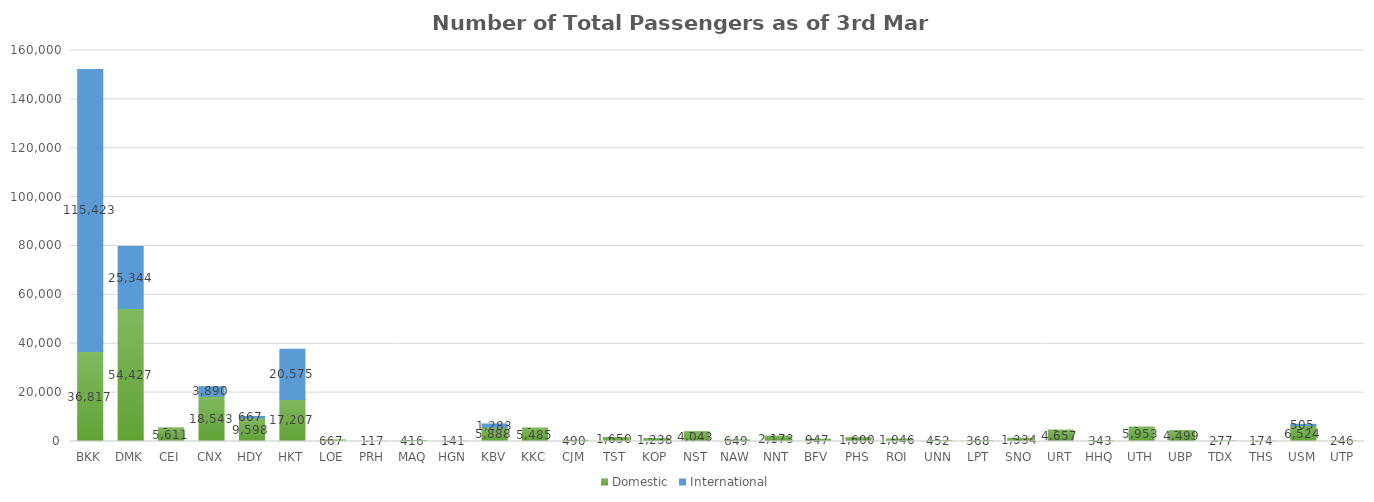
| Category | Domestic | International |
|---|---|---|
| BKK | 36817 | 115423 |
| DMK | 54427 | 25344 |
| CEI | 5611 | 0 |
| CNX | 18543 | 3890 |
| HDY | 9598 | 667 |
| HKT | 17207 | 20575 |
| LOE | 667 | 0 |
| PRH | 117 | 0 |
| MAQ | 416 | 0 |
| HGN | 141 | 0 |
| KBV | 5888 | 1283 |
| KKC | 5485 | 0 |
| CJM | 490 | 0 |
| TST | 1650 | 0 |
| KOP | 1238 | 0 |
| NST | 4043 | 0 |
| NAW | 649 | 0 |
| NNT | 2173 | 0 |
| BFV | 947 | 0 |
| PHS | 1600 | 0 |
| ROI | 1046 | 0 |
| UNN | 452 | 0 |
| LPT | 368 | 0 |
| SNO | 1334 | 0 |
| URT | 4657 | 0 |
| HHQ | 343 | 0 |
| UTH | 5953 | 0 |
| UBP | 4499 | 0 |
| TDX | 277 | 0 |
| THS | 174 | 0 |
| USM | 6524 | 505 |
| UTP | 246 | 0 |